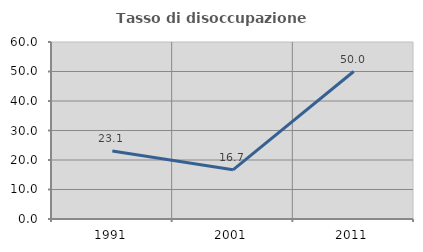
| Category | Tasso di disoccupazione giovanile  |
|---|---|
| 1991.0 | 23.077 |
| 2001.0 | 16.667 |
| 2011.0 | 50 |